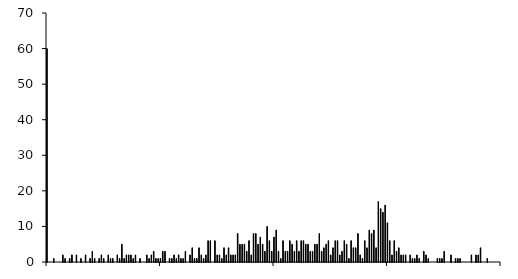
| Category | Series 0 |
|---|---|
| -1.00_-0.99 | 60 |
| -0.99_-0.98 | 0 |
| -0.98_-0.97 | 0 |
| -0.97_-0.96 | 1 |
| -0.96_-0.95 | 0 |
| -0.95_-0.94 | 0 |
| -0.94_-0.93 | 0 |
| -0.93_-0.92 | 2 |
| -0.92_-0.91 | 1 |
| -0.91_-0.90 | 0 |
| -0.90_-0.89 | 1 |
| -0.89_-0.88 | 2 |
| -0.88_-0.87 | 0 |
| -0.87_-0.86 | 2 |
| -0.86_-0.85 | 0 |
| -0.85_-0.84 | 1 |
| -0.84_-0.83 | 0 |
| -0.83_-0.82 | 2 |
| -0.82_-0.81 | 0 |
| -0.81_-0.80 | 1 |
| -0.80_-0.79 | 3 |
| -0.79_-0.78 | 1 |
| -0.78_-0.77 | 0 |
| -0.77_-0.76 | 1 |
| -0.76_-0.75 | 2 |
| -0.75_-0.74 | 1 |
| -0.74_-0.73 | 0 |
| -0.73_-0.72 | 2 |
| -0.72_-0.71 | 1 |
| -0.71_-0.70 | 1 |
| -0.70_-0.69 | 0 |
| -0.69_-0.68 | 2 |
| -0.68_-0.67 | 1 |
| -0.67_-0.66 | 5 |
| -0.66_-0.65 | 1 |
| -0.65_-0.64 | 2 |
| -0.64_-0.63 | 2 |
| -0.63_-0.62 | 2 |
| -0.62_-0.61 | 1 |
| -0.61_-0.60 | 2 |
| -0.60_-0.59 | 0 |
| -0.59_-0.58 | 1 |
| -0.58_-0.57 | 0 |
| -0.57_-0.56 | 0 |
| -0.56_-0.55 | 2 |
| -0.55_-0.54 | 1 |
| -0.54_-0.53 | 2 |
| -0.53_-0.52 | 3 |
| -0.52_-0.51 | 1 |
| -0.51_-0.50 | 1 |
| -0.50_-0.49 | 1 |
| -0.49_-0.48 | 3 |
| -0.48_-0.47 | 3 |
| -0.47_-0.46 | 0 |
| -0.46_-0.45 | 1 |
| -0.45_-0.44 | 1 |
| -0.44_-0.43 | 2 |
| -0.43_-0.42 | 1 |
| -0.42_-0.41 | 2 |
| -0.41_-0.40 | 1 |
| -0.40_-0.39 | 1 |
| -0.39_-0.38 | 3 |
| -0.38_-0.37 | 0 |
| -0.37_-0.36 | 2 |
| -0.36_-0.35 | 4 |
| -0.35_-0.34 | 1 |
| -0.34_-0.33 | 1 |
| -0.33_-0.32 | 4 |
| -0.32_-0.31 | 2 |
| -0.31_-0.30 | 1 |
| -0.30_-0.29 | 2 |
| -0.29_-0.28 | 6 |
| -0.28_-0.27 | 6 |
| -0.27_-0.26 | 0 |
| -0.26_-0.25 | 6 |
| -0.25_-0.24 | 2 |
| -0.24_-0.23 | 2 |
| -0.23_-0.22 | 1 |
| -0.22_-0.21 | 4 |
| -0.21_-0.20 | 2 |
| -0.20_-0.19 | 4 |
| -0.19_-0.18 | 2 |
| -0.18_-0.17 | 2 |
| -0.17_-0.16 | 2 |
| -0.16_-0.15 | 8 |
| -0.15_-0.14 | 5 |
| -0.14_-0.13 | 5 |
| -0.13_-0.12 | 5 |
| -0.12_-0.11 | 3 |
| -0.11_-0.10 | 6 |
| -0.10_-0.09 | 2 |
| -0.09_-0.08 | 8 |
| -0.08_-0.07 | 8 |
| -0.07_-0.06 | 5 |
| -0.06_-0.05 | 7 |
| -0.05_-0.04 | 5 |
| -0.04_-0.03 | 3 |
| -0.03_-0.02 | 10 |
| -0.02_-0.01 | 6 |
| -0.01_0.00 | 3 |
| 0.00_0.01 | 7 |
| 0.01_0.02 | 9 |
| 0.02_0.03 | 3 |
| 0.03_0.04 | 1 |
| 0.04_0.05 | 6 |
| 0.05_0.06 | 3 |
| 0.06_0.07 | 3 |
| 0.07_0.08 | 6 |
| 0.08_0.09 | 5 |
| 0.09_0.10 | 3 |
| 0.10_0.11 | 6 |
| 0.11_0.12 | 3 |
| 0.12_0.13 | 6 |
| 0.13_0.14 | 6 |
| 0.14_0.15 | 5 |
| 0.15_0.16 | 5 |
| 0.16_0.17 | 3 |
| 0.17_0.18 | 3 |
| 0.18_0.19 | 5 |
| 0.19_0.20 | 5 |
| 0.20_0.21 | 8 |
| 0.21_0.22 | 3 |
| 0.22_0.23 | 4 |
| 0.23_0.24 | 5 |
| 0.24_0.25 | 6 |
| 0.25_0.26 | 2 |
| 0.26_0.27 | 4 |
| 0.27_0.28 | 6 |
| 0.28_0.29 | 6 |
| 0.29_0.30 | 2 |
| 0.30_0.31 | 3 |
| 0.31_0.32 | 6 |
| 0.32_0.33 | 5 |
| 0.33_0.34 | 1 |
| 0.34_0.35 | 6 |
| 0.35_0.36 | 4 |
| 0.36_0.37 | 4 |
| 0.37_0.38 | 8 |
| 0.38_0.39 | 2 |
| 0.39_0.40 | 1 |
| 0.40_0.41 | 6 |
| 0.41_0.42 | 4 |
| 0.42_0.43 | 9 |
| 0.43_0.44 | 8 |
| 0.44_0.45 | 9 |
| 0.45_0.46 | 4 |
| 0.46_0.47 | 17 |
| 0.47_0.48 | 15 |
| 0.48_0.49 | 14 |
| 0.49_0.50 | 16 |
| 0.50_0.51 | 11 |
| 0.51_0.52 | 6 |
| 0.52_0.53 | 2 |
| 0.53_0.54 | 6 |
| 0.54_0.55 | 3 |
| 0.55_0.56 | 4 |
| 0.56_0.57 | 2 |
| 0.57_0.58 | 2 |
| 0.58_0.59 | 2 |
| 0.59_0.60 | 0 |
| 0.60_0.61 | 2 |
| 0.61_0.62 | 1 |
| 0.62_0.63 | 1 |
| 0.63_0.64 | 2 |
| 0.64_0.65 | 1 |
| 0.65_0.66 | 0 |
| 0.66_0.67 | 3 |
| 0.67_0.68 | 2 |
| 0.68_0.69 | 1 |
| 0.69_0.70 | 0 |
| 0.70_0.71 | 0 |
| 0.71_0.72 | 0 |
| 0.72_0.73 | 1 |
| 0.73_0.74 | 1 |
| 0.74_0.75 | 1 |
| 0.75_0.76 | 3 |
| 0.76_0.77 | 0 |
| 0.77_0.78 | 0 |
| 0.78_0.79 | 2 |
| 0.79_0.80 | 0 |
| 0.80_0.81 | 1 |
| 0.81_0.82 | 1 |
| 0.82_0.83 | 1 |
| 0.83_0.84 | 0 |
| 0.84_0.85 | 0 |
| 0.85_0.86 | 0 |
| 0.86_0.87 | 0 |
| 0.87_0.88 | 2 |
| 0.88_0.89 | 0 |
| 0.89_0.90 | 2 |
| 0.90_0.91 | 2 |
| 0.91_0.92 | 4 |
| 0.92_0.93 | 0 |
| 0.93_0.94 | 0 |
| 0.94_0.95 | 1 |
| 0.95_0.96 | 0 |
| 0.96_0.97 | 0 |
| 0.97_0.98 | 0 |
| 0.98_0.99 | 0 |
| 0.99_1.00 | 0 |